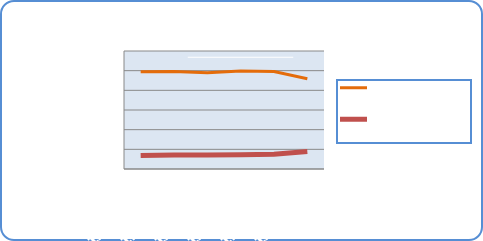
| Category | Motorin Türleri  | Benzin Türleri |
|---|---|---|
| 12/10/18 | 49479792.871 | 6893613.522 |
| 12/11/18 | 49616922.492 | 7181062.905 |
| 12/12/18 | 48882681.283 | 7095619.3 |
| 12/13/18 | 49858731.269 | 7295625.065 |
| 12/14/18 | 49601791.928 | 7561239.134 |
| 12/15/18 | 45910295.092 | 8877155.931 |